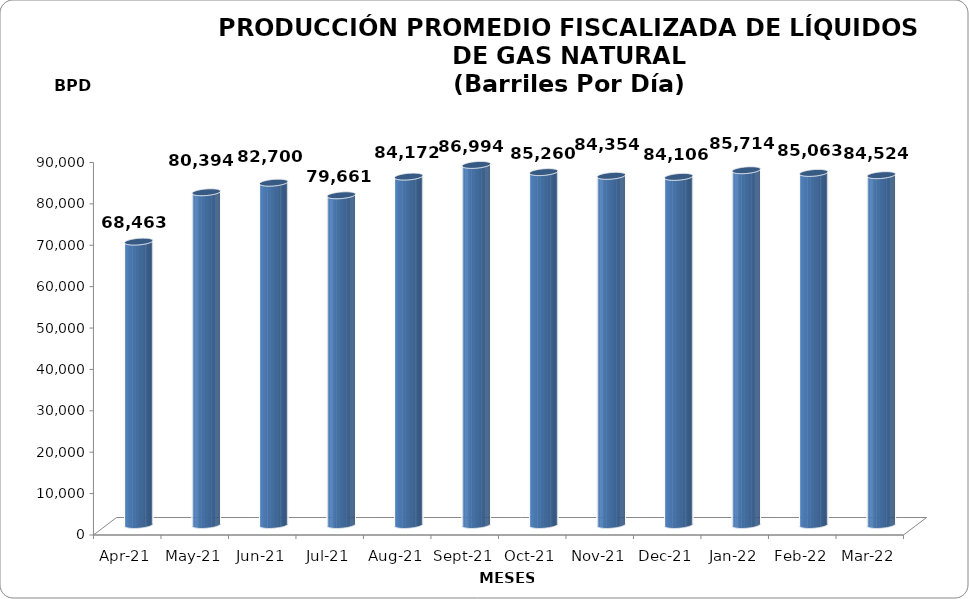
| Category | Series 0 |
|---|---|
| 2021-04-01 | 68463 |
| 2021-05-01 | 80393.645 |
| 2021-06-01 | 82699.833 |
| 2021-07-01 | 79661.29 |
| 2021-08-01 | 84171.548 |
| 2021-09-01 | 86994 |
| 2021-10-01 | 85260 |
| 2021-11-01 | 84354 |
| 2021-12-01 | 84106 |
| 2022-01-01 | 85714.355 |
| 2022-02-01 | 85063 |
| 2022-03-01 | 84523.548 |